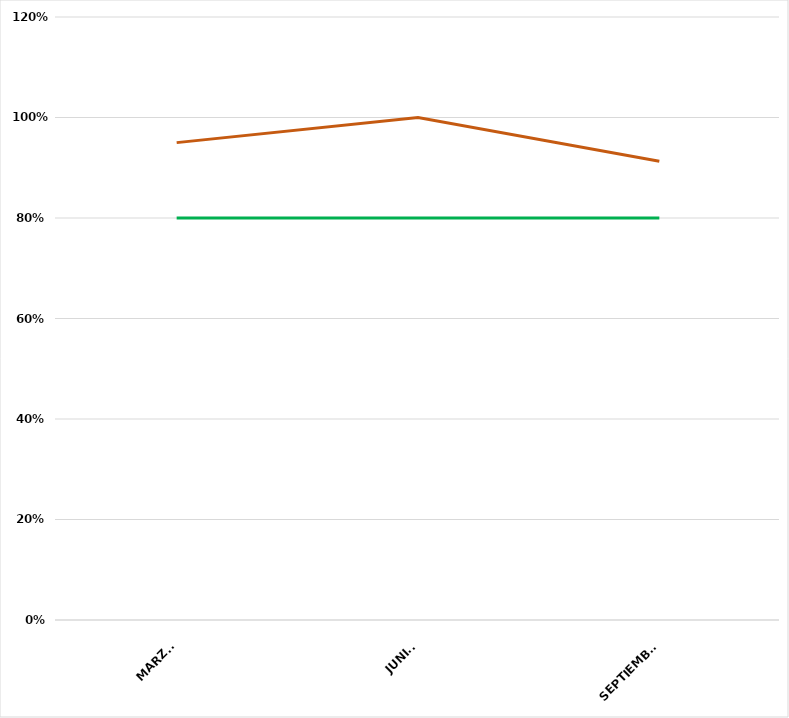
| Category | VALOR  | META PONDERADA |
|---|---|---|
| MARZO | 0.95 | 0.8 |
| JUNIO | 1 | 0.8 |
| SEPTIEMBRE | 0.913 | 0.8 |